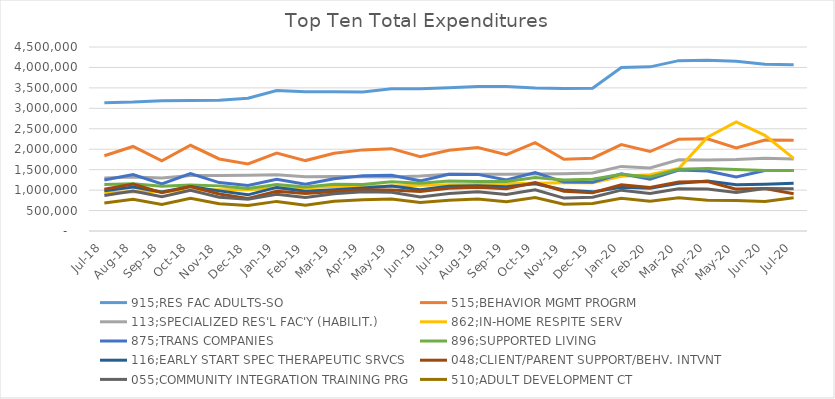
| Category | 915;RES FAC ADULTS-SO | 515;BEHAVIOR MGMT PROGRM | 113;SPECIALIZED RES'L FAC'Y (HABILIT.) | 862;IN-HOME RESPITE SERV | 875;TRANS COMPANIES | 896;SUPPORTED LIVING | 116;EARLY START SPEC THERAPEUTIC SRVCS | 048;CLIENT/PARENT SUPPORT/BEHV. INTVNT | 055;COMMUNITY INTEGRATION TRAINING PRG | 510;ADULT DEVELOPMENT CT |
|---|---|---|---|---|---|---|---|---|---|---|
| Jul-18 | 3137672.89 | 1840073.24 | 1295846.43 | 944324.12 | 1245514.66 | 1138414.84 | 981003.78 | 1022122.38 | 869000.37 | 685827.29 |
| Aug-18 | 3152402.04 | 2067681.63 | 1321969.46 | 956693.95 | 1378995.98 | 1152838.74 | 1076791.24 | 1147242.54 | 980158.74 | 778831.6 |
| Sep-18 | 3183213.81 | 1717571.06 | 1294366.03 | 965623.5 | 1151749.77 | 1092500.68 | 952069.03 | 938805.6 | 837835.09 | 650018.34 |
| Oct-18 | 3190868.94 | 2095883.07 | 1356898.52 | 995913.94 | 1403507.03 | 1126699.05 | 1086093.37 | 1085308.28 | 995994.01 | 801521.86 |
| Nov-18 | 3195312.31 | 1761828.8 | 1355040.19 | 1005901.79 | 1183783.23 | 1103587.74 | 981611.43 | 904824.3 | 824927.47 | 666002.05 |
| Dec-18 | 3247431.46 | 1639215.88 | 1364472.64 | 1007962.2 | 1114076.52 | 1040118.47 | 884362.56 | 793696.9 | 774532.57 | 622382.55 |
| Jan-19 | 3436867.4 | 1906009.92 | 1373222.3 | 1051607.12 | 1267544.09 | 1139415.82 | 1065859.37 | 969885.88 | 898653.19 | 724155.31 |
| Feb-19 | 3403926.09 | 1722281.33 | 1324060.94 | 1056020.67 | 1145193.39 | 1075471.98 | 970702.86 | 917503.01 | 817859.41 | 632106.61 |
| Mar-19 | 3403369.55 | 1902214.1 | 1332585.16 | 1089316.02 | 1278805.29 | 1142642.99 | 1008126.67 | 966448.06 | 909388.92 | 727816.23 |
| Apr-19 | 3402208.34 | 1983955.66 | 1324031.69 | 1093811.07 | 1352208.75 | 1138501.67 | 1052905.53 | 1006604.67 | 958000.78 | 762131.16 |
| May-19 | 3480161.66 | 2013674.42 | 1322730.62 | 1099488.62 | 1365501.98 | 1206058.83 | 1097803.82 | 1001553.79 | 948286.94 | 785305.39 |
| Jun-19 | 3478783.54 | 1816126.56 | 1344436.16 | 1121776.32 | 1226691.45 | 1170459.92 | 1011253.28 | 964738.74 | 832458.15 | 696931.72 |
| Jul-19 | 3503226.48 | 1976520.95 | 1388660.64 | 1129501.49 | 1389986.64 | 1224241.94 | 1093287.5 | 1047988.63 | 918294.71 | 749701.41 |
| Aug-19 | 3531530.18 | 2041311.17 | 1389825.36 | 1136893.75 | 1384627.48 | 1208564.41 | 1104352.5 | 1072137.7 | 961247.73 | 781553.62 |
| Sep-19 | 3534465.09 | 1865340.04 | 1386155.47 | 1157083.68 | 1249304.53 | 1212302.29 | 1081354.4 | 1031431.49 | 891635.28 | 714577.04 |
| Oct-19 | 3499023.49 | 2162461.56 | 1392628.85 | 1168290.66 | 1429836.82 | 1309757.18 | 1154167.55 | 1182381.44 | 1005717.49 | 820633.3 |
| Nov-19 | 3488092.65 | 1753406.23 | 1401266.61 | 1179658.62 | 1197172.65 | 1249430.9 | 1002800.3 | 973949.08 | 804504.62 | 655063.63 |
| Dec-19 | 3492673.62 | 1781082.54 | 1419046.68 | 1178930.47 | 1194723.45 | 1264434.49 | 957011.16 | 935168.92 | 827007.71 | 675199.85 |
| Jan-20 | 3995908.48 | 2112269.66 | 1579811.14 | 1339177.25 | 1397146.24 | 1388135.83 | 1070233.63 | 1130312.17 | 998894.41 | 800458.36 |
| Feb-20 | 4014283.25 | 1943429.71 | 1540154.11 | 1373657.39 | 1267943.37 | 1323465.04 | 1044507.16 | 1062640.99 | 914612.34 | 730491.16 |
| Mar-20 | 4166279.96 | 2244477.46 | 1741997.24 | 1526946.57 | 1492392.42 | 1511019.18 | 1167757.67 | 1200147.42 | 1031317.34 | 813711.59 |
| Apr-20 | 4176708.29 | 2256642.93 | 1734381.38 | 2294636.4 | 1466461.71 | 1529902.09 | 1221226.89 | 1211881.76 | 1028263.26 | 753980.81 |
| May-20 | 4150285.99 | 2032113.55 | 1747767.57 | 2670280.7 | 1318527.81 | 1504331.52 | 1129685.11 | 1024175.58 | 943060.63 | 744885.6 |
| Jun-20 | 4077640.56 | 2226710.11 | 1776989.99 | 2341034.68 | 1478517.91 | 1478786.88 | 1144102.84 | 1039002.96 | 1036890.48 | 722257.71 |
| Jul-20 | 4064398.77 | 2217084.34 | 1760504.85 | 1776086.93 | 1481113.46 | 1479072.15 | 1169567.26 | 912953.3 | 1034829.79 | 815776.65 |